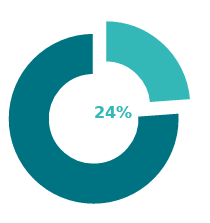
| Category | Series 0 |
|---|---|
| 0 | 0.239 |
| 1 | 0.761 |